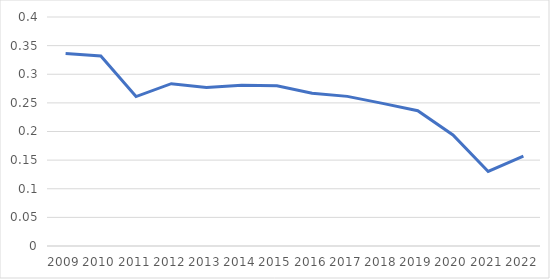
| Category | Series 0 |
|---|---|
| 2009.0 | 0.336 |
| 2010.0 | 0.332 |
| 2011.0 | 0.261 |
| 2012.0 | 0.283 |
| 2013.0 | 0.277 |
| 2014.0 | 0.281 |
| 2015.0 | 0.28 |
| 2016.0 | 0.267 |
| 2017.0 | 0.261 |
| 2018.0 | 0.249 |
| 2019.0 | 0.236 |
| 2020.0 | 0.194 |
| 2021.0 | 0.13 |
| 2022.0 | 0.157 |